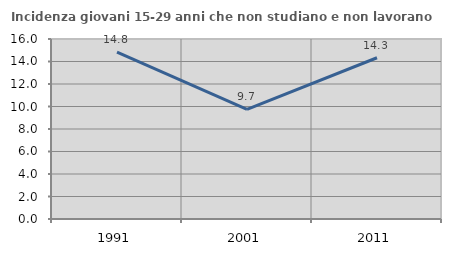
| Category | Incidenza giovani 15-29 anni che non studiano e non lavorano  |
|---|---|
| 1991.0 | 14.833 |
| 2001.0 | 9.742 |
| 2011.0 | 14.332 |